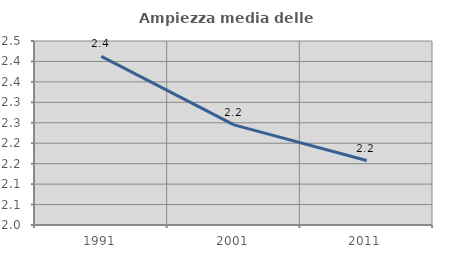
| Category | Ampiezza media delle famiglie |
|---|---|
| 1991.0 | 2.412 |
| 2001.0 | 2.245 |
| 2011.0 | 2.158 |